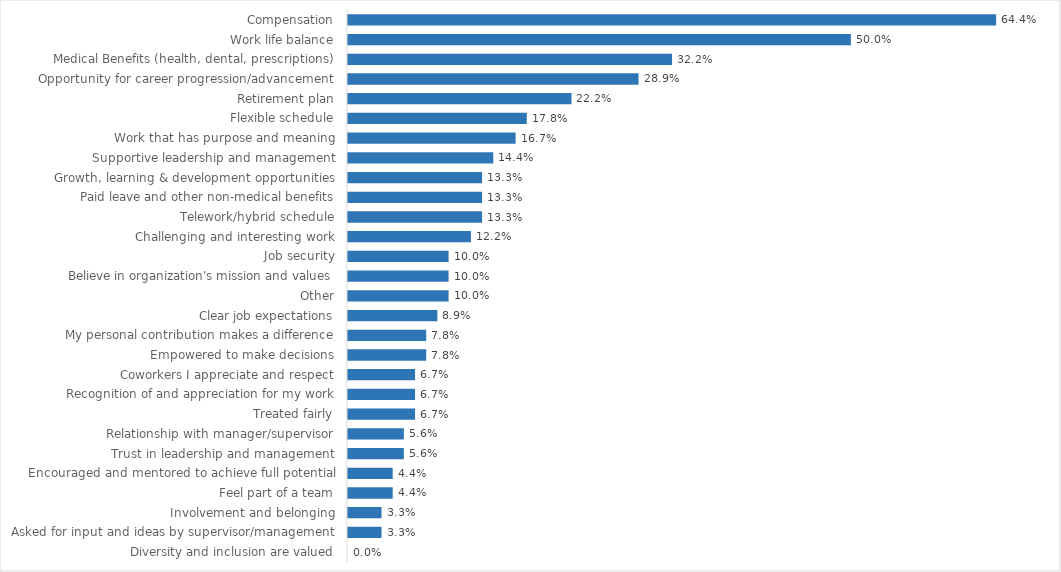
| Category | Forests, Parks & Recreation |
|---|---|
| Compensation | 0.644 |
| Work life balance | 0.5 |
| Medical Benefits (health, dental, prescriptions) | 0.322 |
| Opportunity for career progression/advancement | 0.289 |
| Retirement plan | 0.222 |
| Flexible schedule | 0.178 |
| Work that has purpose and meaning | 0.167 |
| Supportive leadership and management | 0.144 |
| Growth, learning & development opportunities | 0.133 |
| Paid leave and other non-medical benefits | 0.133 |
| Telework/hybrid schedule | 0.133 |
| Challenging and interesting work | 0.122 |
| Job security | 0.1 |
| Believe in organization's mission and values | 0.1 |
| Other | 0.1 |
| Clear job expectations | 0.089 |
| My personal contribution makes a difference | 0.078 |
| Empowered to make decisions | 0.078 |
| Coworkers I appreciate and respect | 0.067 |
| Recognition of and appreciation for my work | 0.067 |
| Treated fairly | 0.067 |
| Relationship with manager/supervisor | 0.056 |
| Trust in leadership and management | 0.056 |
| Encouraged and mentored to achieve full potential | 0.044 |
| Feel part of a team | 0.044 |
| Involvement and belonging | 0.033 |
| Asked for input and ideas by supervisor/management | 0.033 |
| Diversity and inclusion are valued | 0 |